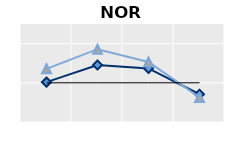
| Category | Foreign-born | Native-born | Series 1 |
|---|---|---|---|
| 15-24 | 1.018 | 1.357 | 1 |
| 25-54 | 1.452 | 1.858 | 1 |
| 55-64 | 1.366 | 1.532 | 1 |
| 65+ | 0.708 | 0.627 | 1 |